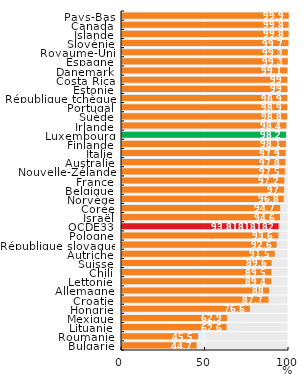
| Category | Series 0 |
|---|---|
| Pays-Bas | 99.9 |
| Canada | 99.8 |
| Islande | 99.8 |
| Slovénie | 99.7 |
| Royaume-Uni | 99.3 |
| Espagne | 99.3 |
| Danemark | 99.1 |
| Costa Rica | 99 |
| Estonie | 99 |
| République tchèque | 98.9 |
| Portugal | 98.9 |
| Suède | 98.8 |
| Irlande | 98.4 |
| Luxembourg | 98.2 |
| Finlande | 98.1 |
| Italie | 97.9 |
| Australie | 97.8 |
| Nouvelle-Zélande | 97.5 |
| France | 97.2 |
| Belgique | 97 |
| Norvège | 96.8 |
| Corée | 94.7 |
| Israël | 94.6 |
| OCDE33 | 93.818 |
| Pologne | 93.6 |
| République slovaque | 92.6 |
| Autriche | 91.5 |
| Suisse | 89.6 |
| Chili | 89.5 |
| Lettonie | 89.4 |
| Allemagne | 88 |
| Croatie | 87.7 |
| Hongrie | 76.6 |
| Mexique | 62.9 |
| Lituanie | 62.6 |
| Roumanie | 45.5 |
| Bulgarie | 44.7 |